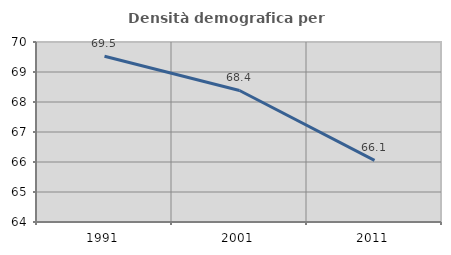
| Category | Densità demografica |
|---|---|
| 1991.0 | 69.525 |
| 2001.0 | 68.384 |
| 2011.0 | 66.056 |